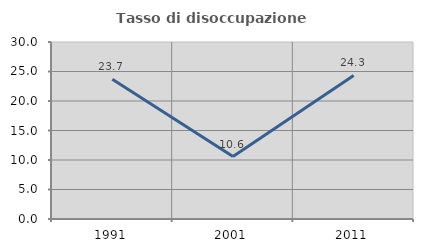
| Category | Tasso di disoccupazione giovanile  |
|---|---|
| 1991.0 | 23.693 |
| 2001.0 | 10.593 |
| 2011.0 | 24.324 |